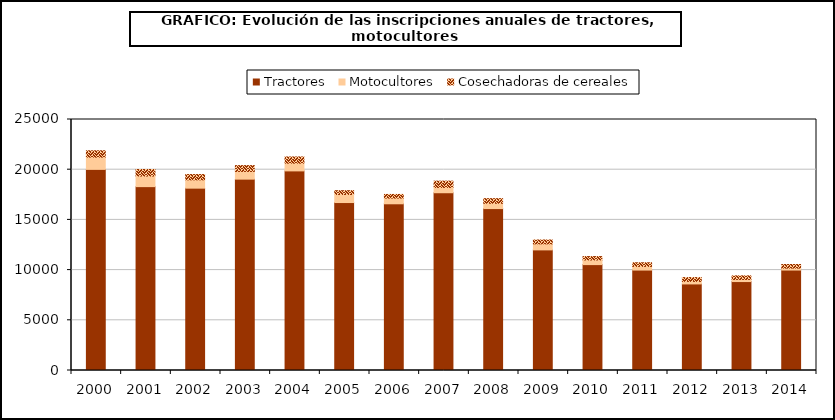
| Category | Tractores | Motocultores | Cosechadoras de cereales |
|---|---|---|---|
| 2000.0 | 20032 | 1220 | 633 |
| 2001.0 | 18314 | 1057 | 649 |
| 2002.0 | 18162 | 830 | 525 |
| 2003.0 | 19060 | 766 | 581 |
| 2004.0 | 19881 | 769 | 620 |
| 2005.0 | 16729 | 800 | 381 |
| 2006.0 | 16605 | 570 | 361 |
| 2007.0 | 17706 | 525 | 630 |
| 2008.0 | 16129 | 525 | 463 |
| 2009.0 | 12013 | 603 | 384 |
| 2010.0 | 10548 | 463 | 336 |
| 2011.0 | 10002 | 366 | 362 |
| 2012.0 | 8623 | 252 | 380 |
| 2013.0 | 8859 | 208 | 361 |
| 2014.0 | 10004 | 196 | 360 |